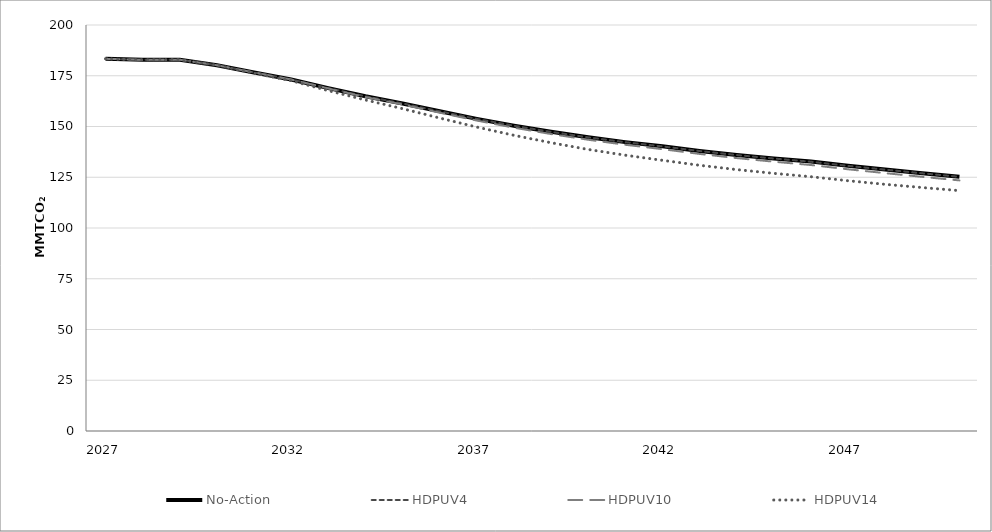
| Category | No-Action | HDPUV4 | HDPUV10 | HDPUV14 |
|---|---|---|---|---|
| 2027.0 | 183.345 | 183.345 | 183.345 | 183.345 |
| 2028.0 | 182.85 | 182.85 | 182.85 | 182.85 |
| 2029.0 | 182.907 | 182.907 | 182.907 | 182.907 |
| 2030.0 | 180.18 | 180.177 | 180.171 | 180.161 |
| 2031.0 | 176.631 | 176.627 | 176.609 | 176.285 |
| 2032.0 | 173.176 | 173.169 | 173.14 | 172.541 |
| 2033.0 | 168.914 | 168.903 | 168.707 | 167.66 |
| 2034.0 | 164.89 | 164.873 | 164.522 | 163.064 |
| 2035.0 | 161.361 | 161.34 | 160.841 | 158.778 |
| 2036.0 | 157.484 | 157.46 | 156.802 | 154.171 |
| 2037.0 | 153.761 | 153.733 | 152.926 | 149.715 |
| 2038.0 | 150.391 | 150.36 | 149.413 | 145.659 |
| 2039.0 | 147.38 | 147.348 | 146.283 | 142.005 |
| 2040.0 | 144.669 | 144.633 | 143.469 | 138.696 |
| 2041.0 | 142.303 | 142.259 | 140.997 | 135.855 |
| 2042.0 | 140.232 | 140.182 | 138.83 | 133.332 |
| 2043.0 | 137.974 | 137.915 | 136.486 | 130.897 |
| 2044.0 | 136.01 | 135.943 | 134.443 | 128.765 |
| 2045.0 | 134.292 | 134.219 | 132.653 | 126.923 |
| 2046.0 | 132.727 | 132.647 | 131.025 | 125.259 |
| 2047.0 | 130.669 | 130.588 | 128.919 | 123.287 |
| 2048.0 | 128.821 | 128.74 | 127.026 | 121.511 |
| 2049.0 | 127.02 | 126.941 | 125.192 | 119.926 |
| 2050.0 | 125.297 | 125.221 | 123.443 | 118.417 |